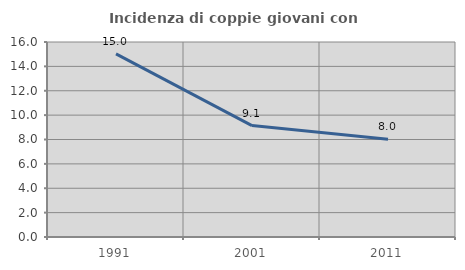
| Category | Incidenza di coppie giovani con figli |
|---|---|
| 1991.0 | 15.025 |
| 2001.0 | 9.141 |
| 2011.0 | 8.016 |